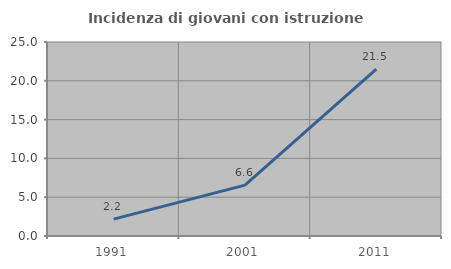
| Category | Incidenza di giovani con istruzione universitaria |
|---|---|
| 1991.0 | 2.174 |
| 2001.0 | 6.557 |
| 2011.0 | 21.519 |